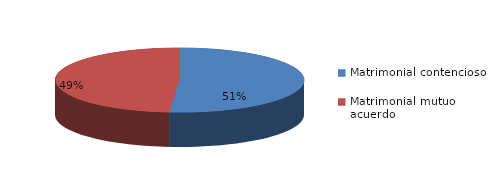
| Category | Series 0 |
|---|---|
| 0 | 1934 |
| 1 | 1837 |